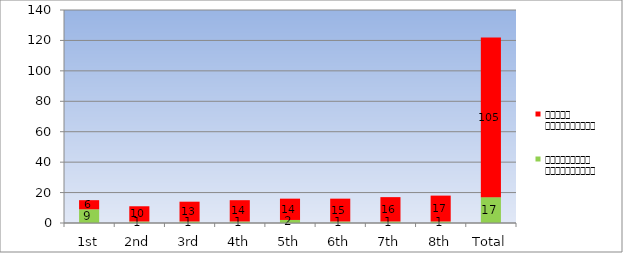
| Category | लाभान्वित विद्यार्थी | वंचित विद्यार्थी |
|---|---|---|
| 1st | 9 | 6 |
| 2nd | 1 | 10 |
| 3rd | 1 | 13 |
| 4th | 1 | 14 |
| 5th | 2 | 14 |
| 6th | 1 | 15 |
| 7th | 1 | 16 |
| 8th | 1 | 17 |
| Total | 17 | 105 |